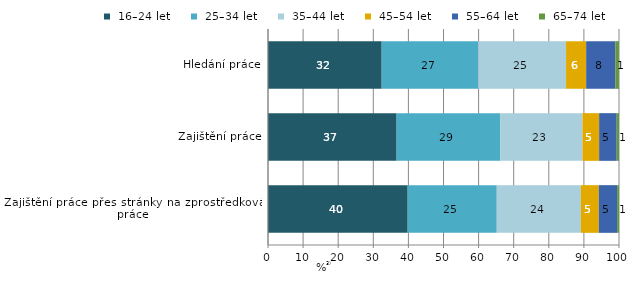
| Category |  16–24 let |  25–34 let |  35–44 let |  45–54 let |  55–64 let |  65–74 let |
|---|---|---|---|---|---|---|
| Zajištění práce přes stránky na zprostředkování práce | 39.791 | 25.385 | 23.944 | 5.117 | 5.216 | 0.546 |
| Zajištění práce | 36.649 | 29.495 | 23.451 | 4.744 | 5.011 | 0.65 |
| Hledání práce | 32.387 | 27.49 | 25.041 | 5.72 | 8.313 | 1.029 |